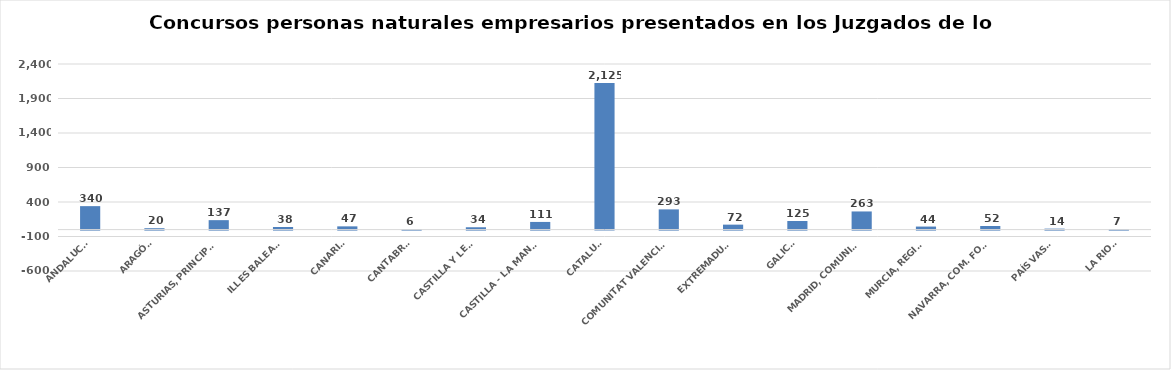
| Category | Series 0 |
|---|---|
| ANDALUCÍA | 340 |
| ARAGÓN | 20 |
| ASTURIAS, PRINCIPADO | 137 |
| ILLES BALEARS | 38 |
| CANARIAS | 47 |
| CANTABRIA | 6 |
| CASTILLA Y LEÓN | 34 |
| CASTILLA - LA MANCHA | 111 |
| CATALUÑA | 2125 |
| COMUNITAT VALENCIANA | 293 |
| EXTREMADURA | 72 |
| GALICIA | 125 |
| MADRID, COMUNIDAD | 263 |
| MURCIA, REGIÓN | 44 |
| NAVARRA, COM. FORAL | 52 |
| PAÍS VASCO | 14 |
| LA RIOJA | 7 |